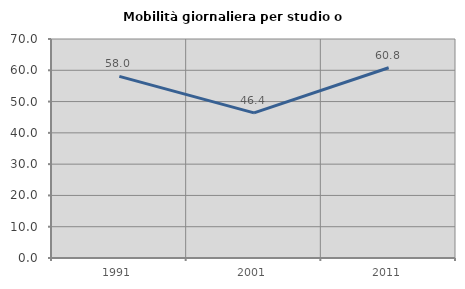
| Category | Mobilità giornaliera per studio o lavoro |
|---|---|
| 1991.0 | 58.038 |
| 2001.0 | 46.395 |
| 2011.0 | 60.806 |